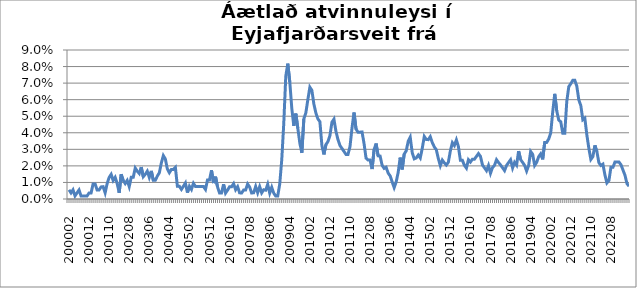
| Category | Series 0 |
|---|---|
| 200002 | 0.006 |
| 200003 | 0.004 |
| 200004 | 0.006 |
| 200005 | 0.002 |
| 200006 | 0.004 |
| 200007 | 0.005 |
| 200008 | 0.002 |
| 200009 | 0.002 |
| 200010 | 0.002 |
| 200011 | 0.002 |
| 200012 | 0.004 |
| 200101 | 0.004 |
| 200102 | 0.009 |
| 200103 | 0.009 |
| 200104 | 0.005 |
| 200105 | 0.005 |
| 200106 | 0.007 |
| 200107 | 0.007 |
| 200108 | 0.004 |
| 200109 | 0.009 |
| 200110 | 0.013 |
| 200111 | 0.015 |
| 200112 | 0.011 |
| 200201 | 0.013 |
| 200202 | 0.009 |
| 200203 | 0.004 |
| 200204 | 0.015 |
| 200205 | 0.011 |
| 200206 | 0.009 |
| 200207 | 0.011 |
| 200208 | 0.007 |
| 200209 | 0.013 |
| 200210 | 0.013 |
| 200211 | 0.019 |
| 200212 | 0.017 |
| 200301 | 0.015 |
| 200302 | 0.019 |
| 200303 | 0.013 |
| 200304 | 0.015 |
| 200305 | 0.017 |
| 200306 | 0.013 |
| 200307 | 0.017 |
| 200308 | 0.011 |
| 200309 | 0.011 |
| 200310 | 0.014 |
| 200311 | 0.016 |
| 200312 | 0.022 |
| 200401 | 0.026 |
| 200402 | 0.024 |
| 200403 | 0.018 |
| 200404 | 0.016 |
| 200405 | 0.018 |
| 200406 | 0.018 |
| 200407 | 0.019 |
| 200408 | 0.008 |
| 200409 | 0.008 |
| 200410 | 0.006 |
| 200411 | 0.008 |
| 200412 | 0.01 |
| 200501 | 0.004 |
| 200502 | 0.008 |
| 200503 | 0.006 |
| 200504 | 0.009 |
| 200505 | 0.008 |
| 200506 | 0.008 |
| 200507 | 0.007 |
| 200508 | 0.007 |
| 200509 | 0.007 |
| 200510 | 0.006 |
| 200511 | 0.012 |
| 200512 | 0.012 |
| 200601 | 0.017 |
| 200602 | 0.01 |
| 200603 | 0.013 |
| 200604 | 0.007 |
| 200605 | 0.004 |
| 200606 | 0.004 |
| 200607 | 0.009 |
| 200608 | 0.004 |
| 200609 | 0.005 |
| 200610 | 0.007 |
| 200611 | 0.007 |
| 200612 | 0.009 |
| 200701 | 0.006 |
| 200702 | 0.007 |
| 200703 | 0.004 |
| 200704 | 0.004 |
| 200705 | 0.005 |
| 200706 | 0.005 |
| 200707 | 0.009 |
| 200708 | 0.007 |
| 200709 | 0.004 |
| 200710 | 0.004 |
| 200711 | 0.008 |
| 200712 | 0.004 |
| 200801 | 0.007 |
| 200802 | 0.004 |
| 200803 | 0.006 |
| 200804 | 0.005 |
| 200805 | 0.009 |
| 200806 | 0.004 |
| 200807 | 0.007 |
| 200808 | 0.004 |
| 200809 | 0.002 |
| 200810 | 0.002 |
| 200811 | 0.009 |
| 200812 | 0.024 |
| 200901 | 0.046 |
| 200902 | 0.074 |
| 200903 | 0.082 |
| 200904 | 0.071 |
| 200905 | 0.055 |
| 200906 | 0.044 |
| 200907 | 0.052 |
| 200908 | 0.043 |
| 200909 | 0.034 |
| 200910 | 0.028 |
| 200911 | 0.048 |
| 200912 | 0.052 |
| 201001 | 0.06 |
| 201002 | 0.068 |
| 201003 | 0.066 |
| 201004 | 0.057 |
| 201005 | 0.052 |
| 201006 | 0.048 |
| 201007 | 0.047 |
| 201008 | 0.032 |
| 201009 | 0.027 |
| 201010 | 0.033 |
| 201011 | 0.035 |
| 201012 | 0.038 |
| 201101 | 0.046 |
| 201102 | 0.048 |
| 201103 | 0.041 |
| 201104 | 0.036 |
| 201105 | 0.032 |
| 201106 | 0.031 |
| 201107 | 0.029 |
| 201108 | 0.027 |
| 201109 | 0.027 |
| 201110 | 0.032 |
| 201111 | 0.043 |
| 201112 | 0.052 |
| 201201 | 0.042 |
| 201202 | 0.04 |
| 201203 | 0.04 |
| 201204 | 0.04 |
| 201205 | 0.033 |
| 201206 | 0.025 |
| 201207 | 0.024 |
| 201208 | 0.024 |
| 201209 | 0.018 |
| 201210 | 0.03 |
| 201211 | 0.034 |
| 201212 | 0.026 |
| 201301 | 0.026 |
| 201302 | 0.02 |
| 201303 | 0.019 |
| 201304 | 0.019 |
| 201305 | 0.016 |
| 201306 | 0.014 |
| 201307 | 0.01 |
| 201308 | 0.007 |
| 201309 | 0.01 |
| 201310 | 0.016 |
| 201311 | 0.025 |
| 201312 | 0.018 |
| 201401 | 0.027 |
| 201402 | 0.029 |
| 201403 | 0.035 |
| 201404 | 0.037 |
| 201405 | 0.028 |
| 201406 | 0.024 |
| 201407 | 0.025 |
| 201408 | 0.027 |
| 201409 | 0.025 |
| 201410 | 0.031 |
| 201411 | 0.038 |
| 201412 | 0.036 |
| 201501 | 0.036 |
| 201502 | 0.038 |
| 201503 | 0.034 |
| 201504 | 0.031 |
| 201505 | 0.03 |
| 201506 | 0.024 |
| 201507 | 0.02 |
| 201508 | 0.023 |
| 201509 | 0.022 |
| 201510 | 0.021 |
| 201511 | 0.022 |
| 201512 | 0.029 |
| 201601 | 0.034 |
| 201602 | 0.032 |
| 201603 | 0.036 |
| 201604 | 0.032 |
| 201605 | 0.023 |
| 201606 | 0.023 |
| 201607 | 0.02 |
| 201608 | 0.019 |
| 201609 | 0.024 |
| 201610 | 0.022 |
| 201611 | 0.024 |
| 201612 | 0.024 |
| 201701 | 0.026 |
| 201702 | 0.027 |
| 201703 | 0.026 |
| 201704 | 0.021 |
| 201705 | 0.019 |
| 201706 | 0.017 |
| 201707 | 0.02 |
| 201708 | 0.016 |
| 201709 | 0.019 |
| 201710 | 0.02 |
| 201711 | 0.024 |
| 201712 | 0.022 |
| 201801 | 0.021 |
| 201802 | 0.019 |
| 201803 | 0.017 |
| 201804 | 0.02 |
| 201805 | 0.022 |
| 201806 | 0.024 |
| 201807 | 0.019 |
| 201808 | 0.022 |
| 201809 | 0.02 |
| 201810 | 0.029 |
| 201811 | 0.024 |
| 201812 | 0.022 |
| 201901 | 0.02 |
| 201902 | 0.017 |
| 201903 | 0.02 |
| 201904 | 0.029 |
| 201905 | 0.027 |
| 201906 | 0.02 |
| 201907 | 0.022 |
| 201908 | 0.026 |
| 201909 | 0.027 |
| 201910 | 0.024 |
| 201911 | 0.034 |
| 201912 | 0.034 |
| 202001 | 0.036 |
| 202002 | 0.04 |
| 202003 | 0.053 |
| 202004 | 0.064 |
| 202005 | 0.053 |
| 202006 | 0.048 |
| 202007 | 0.047 |
| 202008 | 0.04 |
| 202009 | 0.04 |
| 202010 | 0.059 |
| 202011 | 0.068 |
| 202012 | 0.07 |
| 202101 | 0.072 |
| 202102 | 0.072 |
| 202103 | 0.068 |
| 202104 | 0.06 |
| 202105 | 0.056 |
| 202106 | 0.048 |
| 202107 | 0.049 |
| 202108 | 0.039 |
| 202109 | 0.031 |
| 202110 | 0.024 |
| 202111 | 0.026 |
| 202112 | 0.032 |
| 202201 | 0.029 |
| 202202 | 0.022 |
| 202203 | 0.02 |
| 202204 | 0.021 |
| 202205 | 0.015 |
| 202206 | 0.01 |
| 202207 | 0.011 |
| 202208 | 0.019 |
| 202209 | 0.019 |
| 202210 | 0.022 |
| 202211 | 0.022 |
| 202212 | 0.022 |
| 202301 | 0.021 |
| 202302 | 0.018 |
| 202303 | 0.014 |
| 202304 | 0.009 |
| 202305 | 0.008 |